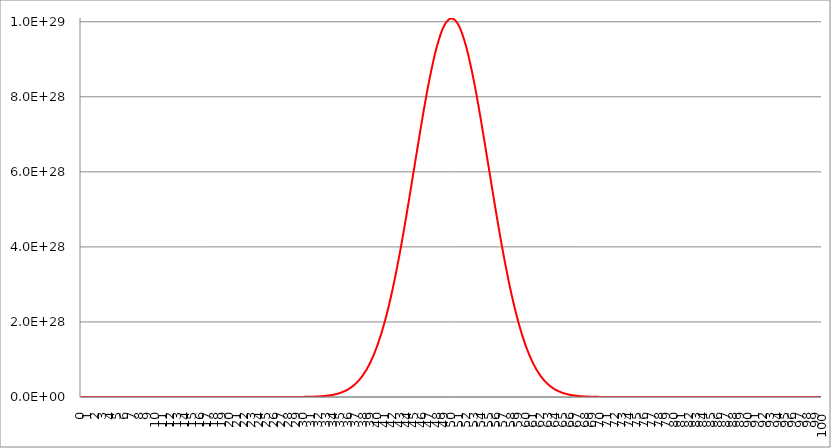
| Category | Series 0 |
|---|---|
| 0.0 | 1 |
| 1.0 | 100 |
| 2.0 | 4950 |
| 3.0 | 161700 |
| 4.0 | 3921225 |
| 5.0 | 75287520 |
| 6.0 | 1192052400 |
| 7.0 | 16007560800 |
| 8.0 | 186087894300 |
| 9.0 | 1902231808400 |
| 10.0 | 17310309456440 |
| 11.0 | 141629804643600 |
| 12.0 | 1050421051106700 |
| 13.0 | 7110542499799200 |
| 14.0 | 44186942677323600 |
| 15.0 | 253338471349988992 |
| 16.0 | 1345860629046810112 |
| 17.0 | 6650134872937199616 |
| 18.0 | 30664510802988199936 |
| 19.0 | 132341572939211997184 |
| 20.0 | 535983370403809984512 |
| 21.0 | 2041841411062130016256 |
| 22.0 | 7332066885177660407808 |
| 23.0 | 24865270306254698315776 |
| 24.0 | 79776075565900400427008 |
| 25.0 | 242519269720336990470144 |
| 26.0 | 699574816500973008060416 |
| 27.0 | 1917353200780440116396032 |
| 28.0 | 4998813702034729765699584 |
| 29.0 | 12410847811948299033772032 |
| 30.0 | 29372339821610998431744000 |
| 31.0 | 66324638306863497185591296 |
| 32.0 | 143012501349173995168071680 |
| 33.0 | 294692427022540998185058304 |
| 34.0 | 580717429720889984953614336 |
| 35.0 | 1095067153187960052653228032 |
| 36.0 | 1977204582144929942065905664 |
| 37.0 | 3420029547493939811572514816 |
| 38.0 | 5670048986634689615270772736 |
| 39.0 | 9013924030034639622122766336 |
| 40.0 | 13746234145802799420287221760 |
| 41.0 | 20116440213369998856933081088 |
| 42.0 | 28258808871162600268557713408 |
| 43.0 | 38116532895986699534684127232 |
| 44.0 | 49378235797073697534401052672 |
| 45.0 | 61448471214136199152945594368 |
| 46.0 | 73470998190815001604406640640 |
| 47.0 | 84413487283064093430092136448 |
| 48.0 | 93206558875050002832928276480 |
| 49.0 | 98913082887808091953668554752 |
| 50.0 | 100891344545564008557668466688 |
| 51.0 | 98913082887808091953668554752 |
| 52.0 | 93206558875050002832928276480 |
| 53.0 | 84413487283064093430092136448 |
| 54.0 | 73470998190815001604406640640 |
| 55.0 | 61448471214136199152945594368 |
| 56.0 | 49378235797073697534401052672 |
| 57.0 | 38116532895986699534684127232 |
| 58.0 | 28258808871162600268557713408 |
| 59.0 | 20116440213369998856933081088 |
| 60.0 | 13746234145802799420287221760 |
| 61.0 | 9013924030034639622122766336 |
| 62.0 | 5670048986634689615270772736 |
| 63.0 | 3420029547493939811572514816 |
| 64.0 | 1977204582144929942065905664 |
| 65.0 | 1095067153187960052653228032 |
| 66.0 | 580717429720889984953614336 |
| 67.0 | 294692427022540998185058304 |
| 68.0 | 143012501349173995168071680 |
| 69.0 | 66324638306863497185591296 |
| 70.0 | 29372339821610998431744000 |
| 71.0 | 12410847811948299033772032 |
| 72.0 | 4998813702034729765699584 |
| 73.0 | 1917353200780440116396032 |
| 74.0 | 699574816500973008060416 |
| 75.0 | 242519269720336990470144 |
| 76.0 | 79776075565900400427008 |
| 77.0 | 24865270306254698315776 |
| 78.0 | 7332066885177660407808 |
| 79.0 | 2041841411062130016256 |
| 80.0 | 535983370403809984512 |
| 81.0 | 132341572939211997184 |
| 82.0 | 30664510802988199936 |
| 83.0 | 6650134872937199616 |
| 84.0 | 1345860629046810112 |
| 85.0 | 253338471349988992 |
| 86.0 | 44186942677323600 |
| 87.0 | 7110542499799200 |
| 88.0 | 1050421051106700 |
| 89.0 | 141629804643600 |
| 90.0 | 17310309456440 |
| 91.0 | 1902231808400 |
| 92.0 | 186087894300 |
| 93.0 | 16007560800 |
| 94.0 | 1192052400 |
| 95.0 | 75287520 |
| 96.0 | 3921225 |
| 97.0 | 161700 |
| 98.0 | 4950 |
| 99.0 | 100 |
| 100.0 | 1 |